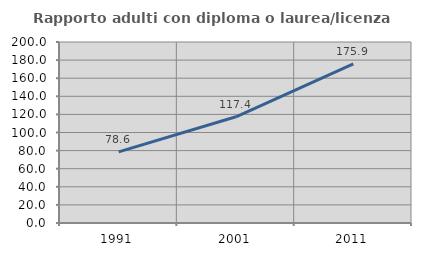
| Category | Rapporto adulti con diploma o laurea/licenza media  |
|---|---|
| 1991.0 | 78.641 |
| 2001.0 | 117.355 |
| 2011.0 | 175.912 |